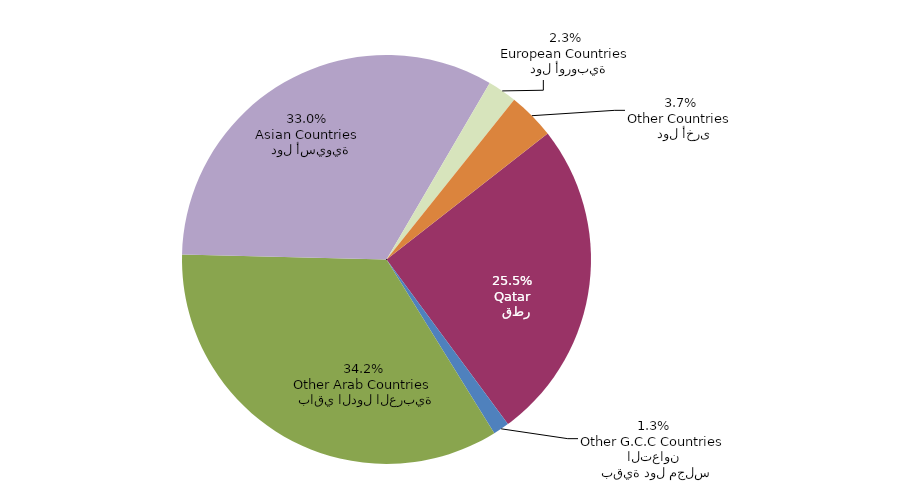
| Category | Series 0 |
|---|---|
|   قطر
Qatar | 1377 |
|   بقية دول مجلس التعاون
Other G.C.C Countries | 69 |
|   باقي الدول العربية
Other Arab Countries | 1852 |
|   دول أسيوية
Asian Countries | 1788 |
|   دول أوروبية
European Countries | 125 |
|   دول أخرى
Other Countries | 201 |